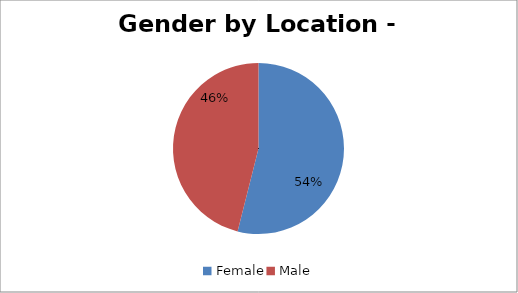
| Category | Leeds |
|---|---|
| Female | 356 |
| Male | 304 |